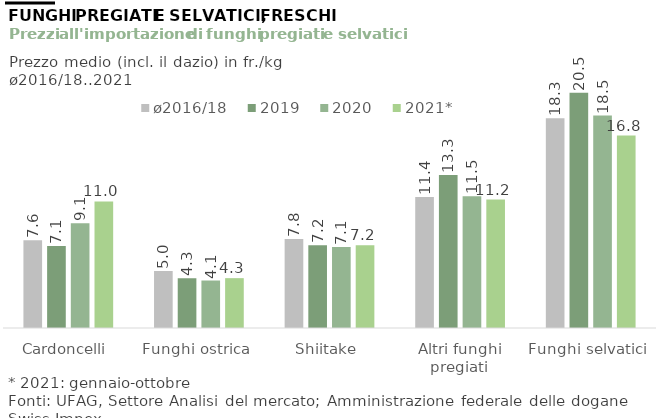
| Category | ø2016/18 | 2019 | 2020 | 2021* |
|---|---|---|---|---|
| Cardoncelli | 7.637 | 7.138 | 9.128 | 11.024 |
| Funghi ostrica | 4.974 | 4.334 | 4.136 | 4.342 |
| Shiitake | 7.756 | 7.212 | 7.053 | 7.206 |
| Altri funghi pregiati | 11.408 | 13.336 | 11.481 | 11.187 |
| Funghi selvatici | 18.267 | 20.486 | 18.5 | 16.764 |